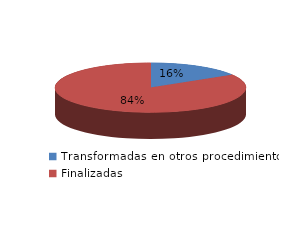
| Category | Series 0 |
|---|---|
| Transformadas en otros procedimientos | 1211 |
| Finalizadas | 6286 |